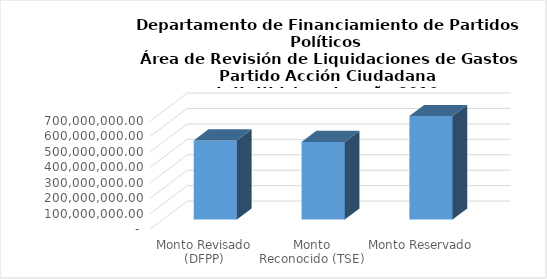
| Category | Series 0 |
|---|---|
| Monto Revisado (DFPP) | 512788585.95 |
| Monto Reconocido (TSE) | 502871488.48 |
| Monto Reservado  | 670347873.07 |